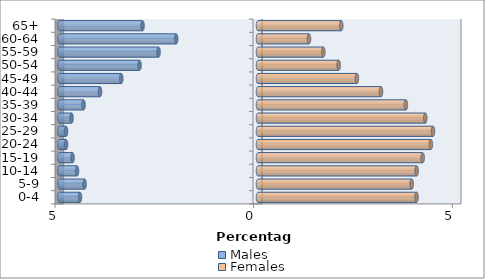
| Category | Males | Females |
|---|---|---|
| 0-4 | -4.48 | 3.991 |
| 5-9 | -4.365 | 3.868 |
| 10-14 | -4.555 | 3.993 |
| 15-19 | -4.668 | 4.144 |
| 20-24 | -4.831 | 4.351 |
| 25-29 | -4.831 | 4.404 |
| 30-34 | -4.692 | 4.209 |
| 35-39 | -4.392 | 3.722 |
| 40-44 | -3.976 | 3.096 |
| 45-49 | -3.441 | 2.489 |
| 50-54 | -2.981 | 2.03 |
| 55-59 | -2.503 | 1.644 |
| 60-64 | -2.059 | 1.284 |
| 65+ | -2.906 | 2.095 |